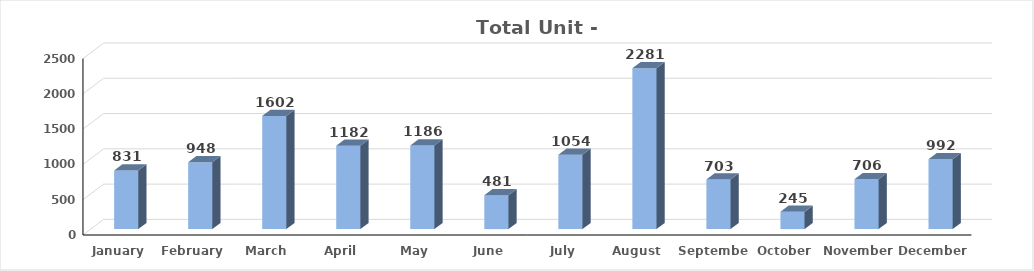
| Category | UNIT |
|---|---|
| January | 831 |
| February | 948 |
| March | 1602 |
| April | 1182 |
| May | 1186 |
| June | 481 |
| July | 1054 |
| August | 2281 |
| September | 703 |
| October | 245 |
| November | 706 |
| December | 992 |